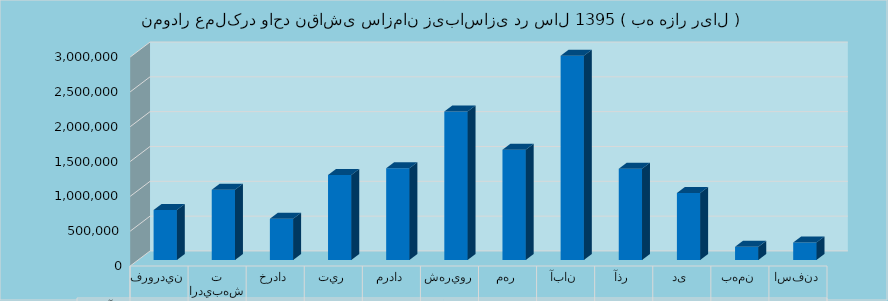
| Category | برآورد |
|---|---|
| فروردين | 718910 |
| ارديبهشت | 1008020 |
| خرداد | 592260 |
| تير | 1219904 |
| مرداد | 1317120 |
| شهريور | 2130782 |
| مهر | 1583890 |
| آبان | 2931920 |
| آذر | 1309440 |
| دی | 960647 |
| بهمن | 188676 |
| اسفند | 251240 |